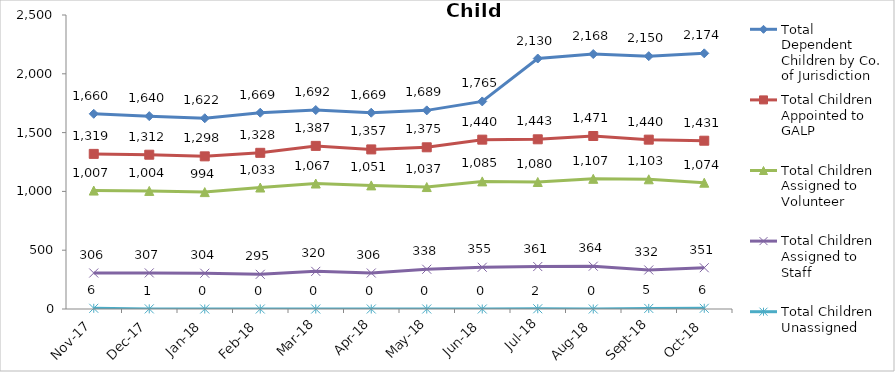
| Category | Total Dependent Children by Co. of Jurisdiction | Total Children Appointed to GALP | Total Children Assigned to Volunteer | Total Children Assigned to Staff | Total Children Unassigned |
|---|---|---|---|---|---|
| 2017-11-01 | 1660 | 1319 | 1007 | 306 | 6 |
| 2017-12-01 | 1640 | 1312 | 1004 | 307 | 1 |
| 2018-01-01 | 1622 | 1298 | 994 | 304 | 0 |
| 2018-02-01 | 1669 | 1328 | 1033 | 295 | 0 |
| 2018-03-01 | 1692 | 1387 | 1067 | 320 | 0 |
| 2018-04-01 | 1669 | 1357 | 1051 | 306 | 0 |
| 2018-05-01 | 1689 | 1375 | 1037 | 338 | 0 |
| 2018-06-01 | 1765 | 1440 | 1085 | 355 | 0 |
| 2018-07-01 | 2130 | 1443 | 1080 | 361 | 2 |
| 2018-08-01 | 2168 | 1471 | 1107 | 364 | 0 |
| 2018-09-01 | 2150 | 1440 | 1103 | 332 | 5 |
| 2018-10-01 | 2174 | 1431 | 1074 | 351 | 6 |